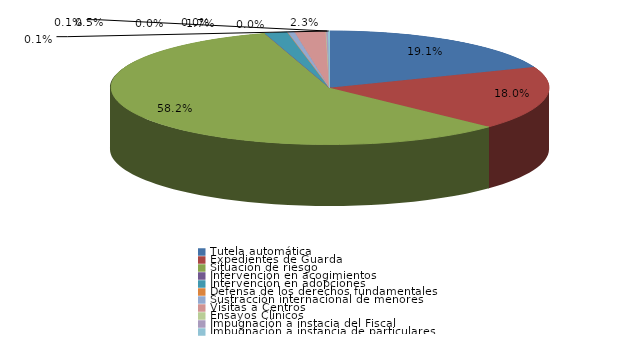
| Category | Series 0 |
|---|---|
| Tutela automática | 305 |
| Expedientes de Guarda | 288 |
| Situación de riesgo | 931 |
| Intervención en acogimientos | 0 |
| Intervención en adopciones | 27 |
| Defensa de los derechos fundamentales | 0 |
| Sustracción internacional de menores | 8 |
| Visitas a Centros | 37 |
| Ensayos Clínicos | 0 |
| Impugnación a instacia del Fiscal | 2 |
| Impugnación a instancia de particulares | 2 |